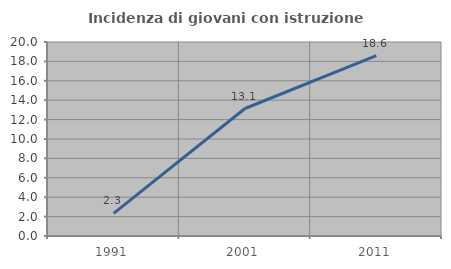
| Category | Incidenza di giovani con istruzione universitaria |
|---|---|
| 1991.0 | 2.326 |
| 2001.0 | 13.143 |
| 2011.0 | 18.595 |